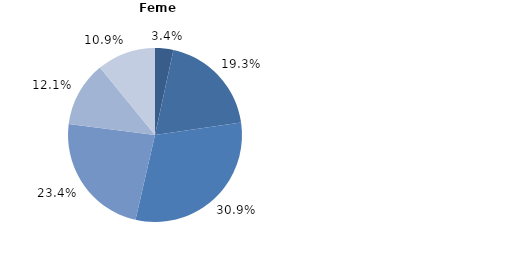
| Category | Series 0 |
|---|---|
| până la 20 ani | 3.4 |
| 20-29 ani | 19.3 |
| 30-39 ani | 30.9 |
| 40-49 ani | 23.4 |
| 50-59 ani | 12.1 |
| 60 și peste | 10.9 |